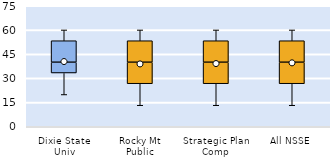
| Category | 25th | 50th | 75th |
|---|---|---|---|
| Dixie State Univ | 33.333 | 6.667 | 13.333 |
| Rocky Mt Public | 26.667 | 13.333 | 13.333 |
| Strategic Plan Comp | 26.667 | 13.333 | 13.333 |
| All NSSE | 26.667 | 13.333 | 13.333 |